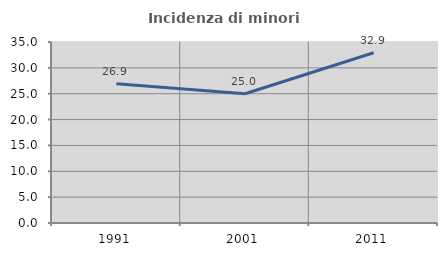
| Category | Incidenza di minori stranieri |
|---|---|
| 1991.0 | 26.923 |
| 2001.0 | 25 |
| 2011.0 | 32.911 |